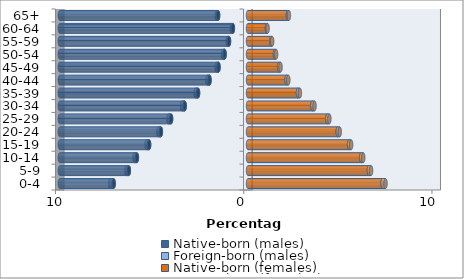
| Category | Native-born (males) | Foreign-born (males) | Native-born (females) | Foreign-born (females) |
|---|---|---|---|---|
| 0-4 | -7.135 | -0.177 | 7.146 | 0.159 |
| 5-9 | -6.331 | -0.13 | 6.42 | 0.118 |
| 10-14 | -5.902 | -0.127 | 6.012 | 0.111 |
| 15-19 | -5.253 | -0.131 | 5.37 | 0.109 |
| 20-24 | -4.628 | -0.135 | 4.764 | 0.109 |
| 25-29 | -4.086 | -0.14 | 4.21 | 0.112 |
| 30-34 | -3.363 | -0.141 | 3.424 | 0.111 |
| 35-39 | -2.653 | -0.133 | 2.654 | 0.104 |
| 40-44 | -2.045 | -0.12 | 2.049 | 0.092 |
| 45-49 | -1.566 | -0.101 | 1.651 | 0.077 |
| 50-54 | -1.243 | -0.083 | 1.43 | 0.062 |
| 55-59 | -1.01 | -0.066 | 1.235 | 0.049 |
| 60-64 | -0.803 | -0.053 | 1.003 | 0.037 |
| 65+ | -1.588 | -0.067 | 2.119 | 0.054 |